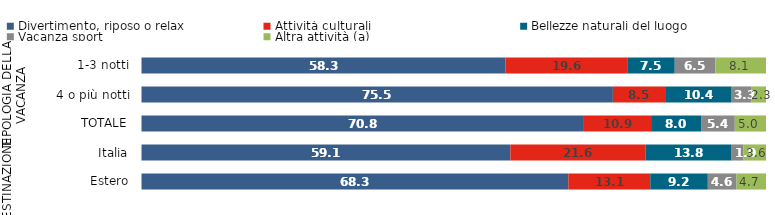
| Category | Divertimento, riposo o relax                 | Attività culturali | Bellezze naturali del luogo          | Vacanza sport                                 | Altra attività (a)        |
|---|---|---|---|---|---|
| 0 | 58.3 | 19.6 | 7.5 | 6.5 | 8.1 |
| 1 | 75.5 | 8.5 | 10.4 | 3.3 | 2.3 |
| 2 | 70.8 | 10.9 | 8 | 5.4 | 5 |
| 3 | 59.1 | 21.6 | 13.8 | 1.9 | 3.6 |
| 4 | 68.3 | 13.1 | 9.2 | 4.6 | 4.7 |